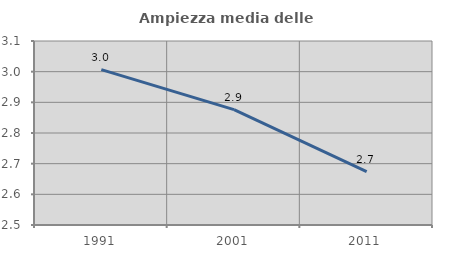
| Category | Ampiezza media delle famiglie |
|---|---|
| 1991.0 | 3.007 |
| 2001.0 | 2.876 |
| 2011.0 | 2.674 |